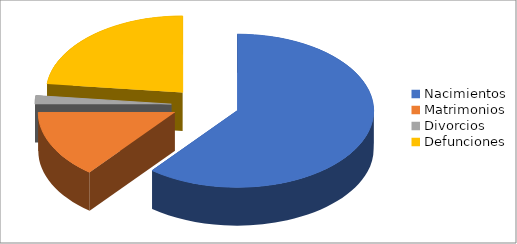
| Category | Series 0 |
|---|---|
| Nacimientos | 34 |
| Matrimonios | 8 |
| Divorcios | 1 |
| Defunciones | 13 |